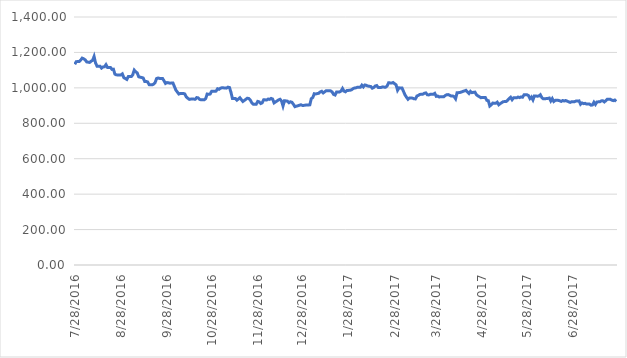
| Category | Series 0 |
|---|---|
| 7/28/16 | 1133 |
| 7/29/16 | 1148 |
| 7/31/16 | 1148.5 |
| 8/1/16 | 1156.5 |
| 8/2/16 | 1168 |
| 8/3/16 | 1164 |
| 8/4/16 | 1158.5 |
| 8/5/16 | 1146.5 |
| 8/7/16 | 1143.5 |
| 8/8/16 | 1150.5 |
| 8/9/16 | 1155 |
| 8/10/16 | 1177 |
| 8/11/16 | 1140.5 |
| 8/12/16 | 1122 |
| 8/14/16 | 1122.5 |
| 8/15/16 | 1111.5 |
| 8/16/16 | 1118 |
| 8/17/16 | 1119 |
| 8/18/16 | 1131 |
| 8/19/16 | 1115.5 |
| 8/21/16 | 1115.5 |
| 8/22/16 | 1104.5 |
| 8/23/16 | 1105.5 |
| 8/24/16 | 1077.5 |
| 8/25/16 | 1073.5 |
| 8/26/16 | 1072.5 |
| 8/28/16 | 1073 |
| 8/29/16 | 1079 |
| 8/30/16 | 1057.5 |
| 8/31/16 | 1053 |
| 9/1/16 | 1047.5 |
| 9/2/16 | 1063.5 |
| 9/4/16 | 1063.5 |
| 9/5/16 | 1074 |
| 9/6/16 | 1100 |
| 9/7/16 | 1090.5 |
| 9/8/16 | 1084.5 |
| 9/9/16 | 1062.5 |
| 9/12/16 | 1056 |
| 9/13/16 | 1036.5 |
| 9/14/16 | 1036.5 |
| 9/15/16 | 1033.5 |
| 9/16/16 | 1018 |
| 9/18/16 | 1017 |
| 9/19/16 | 1021 |
| 9/20/16 | 1029.5 |
| 9/21/16 | 1052.5 |
| 9/22/16 | 1055.5 |
| 9/23/16 | 1053.5 |
| 9/25/16 | 1053.5 |
| 9/26/16 | 1040 |
| 9/27/16 | 1025 |
| 9/28/16 | 1030 |
| 9/29/16 | 1028.5 |
| 9/30/16 | 1026.5 |
| 10/2/16 | 1027.5 |
| 10/3/16 | 1007.5 |
| 10/4/16 | 987 |
| 10/5/16 | 976 |
| 10/6/16 | 965 |
| 10/7/16 | 968.5 |
| 10/9/16 | 968.5 |
| 10/10/16 | 965.5 |
| 10/11/16 | 948.5 |
| 10/12/16 | 941.5 |
| 10/13/16 | 935 |
| 10/14/16 | 936.5 |
| 10/16/16 | 936.5 |
| 10/17/16 | 936 |
| 10/18/16 | 945 |
| 10/19/16 | 943.5 |
| 10/20/16 | 934.5 |
| 10/21/16 | 932.5 |
| 10/23/16 | 932.5 |
| 10/24/16 | 939 |
| 10/25/16 | 965 |
| 10/26/16 | 963.5 |
| 10/27/16 | 965 |
| 10/28/16 | 980.5 |
| 10/30/16 | 981 |
| 10/31/16 | 981.5 |
| 11/1/16 | 995 |
| 11/2/16 | 992 |
| 11/3/16 | 998 |
| 11/4/16 | 1001 |
| 11/6/16 | 999 |
| 11/7/16 | 998.5 |
| 11/8/16 | 1004 |
| 11/9/16 | 1002 |
| 11/10/16 | 975 |
| 11/11/16 | 940 |
| 11/13/16 | 940 |
| 11/14/16 | 930.5 |
| 11/15/16 | 937 |
| 11/16/16 | 944.25 |
| 11/17/16 | 933.5 |
| 11/18/16 | 923 |
| 11/21/16 | 941.5 |
| 11/22/16 | 940 |
| 11/23/16 | 931 |
| 11/24/16 | 916 |
| 11/25/16 | 908 |
| 11/27/16 | 908 |
| 11/28/16 | 923.5 |
| 11/29/16 | 921 |
| 11/30/16 | 911.5 |
| 12/1/16 | 915.5 |
| 12/2/16 | 933 |
| 12/4/16 | 931.5 |
| 12/5/16 | 937 |
| 12/6/16 | 935 |
| 12/7/16 | 940.5 |
| 12/8/16 | 937 |
| 12/9/16 | 915 |
| 12/12/16 | 932 |
| 12/13/16 | 935.5 |
| 12/14/16 | 926 |
| 12/15/16 | 897.5 |
| 12/16/16 | 927.5 |
| 12/18/16 | 925 |
| 12/19/16 | 916 |
| 12/20/16 | 921.5 |
| 12/21/16 | 918.5 |
| 12/22/16 | 907 |
| 12/23/16 | 893.75 |
| 12/27/16 | 904.5 |
| 12/28/16 | 901 |
| 12/29/16 | 901 |
| 12/30/16 | 902.5 |
| 1/2/17 | 904 |
| 1/3/17 | 939 |
| 1/4/17 | 945.25 |
| 1/5/17 | 967 |
| 1/6/17 | 965.5 |
| 1/8/17 | 969.5 |
| 1/9/17 | 977 |
| 1/10/17 | 980.5 |
| 1/11/17 | 971.25 |
| 1/12/17 | 977.5 |
| 1/13/17 | 984 |
| 1/16/17 | 983 |
| 1/17/17 | 977 |
| 1/18/17 | 963 |
| 1/19/17 | 959.5 |
| 1/20/17 | 977 |
| 1/22/17 | 977 |
| 1/23/17 | 982 |
| 1/24/17 | 996.5 |
| 1/25/17 | 981.5 |
| 1/26/17 | 977.75 |
| 1/27/17 | 985.5 |
| 1/29/17 | 986 |
| 1/30/17 | 989 |
| 1/31/17 | 995 |
| 2/1/17 | 999 |
| 2/2/17 | 1000 |
| 2/3/17 | 1003.5 |
| 2/5/17 | 1003.5 |
| 2/6/17 | 1015.25 |
| 2/7/17 | 1005.5 |
| 2/8/17 | 1016.25 |
| 2/9/17 | 1014.25 |
| 2/10/17 | 1010.25 |
| 2/12/17 | 1007.5 |
| 2/13/17 | 998 |
| 2/14/17 | 1002.5 |
| 2/15/17 | 1010.5 |
| 2/16/17 | 1013 |
| 2/17/17 | 1002 |
| 2/19/17 | 1002.5 |
| 2/20/17 | 1005.5 |
| 2/21/17 | 1004 |
| 2/22/17 | 1004 |
| 2/23/17 | 1011 |
| 2/24/17 | 1029 |
| 2/26/17 | 1027 |
| 2/27/17 | 1030 |
| 2/28/17 | 1023.5 |
| 3/1/17 | 1017 |
| 3/2/17 | 986.5 |
| 3/3/17 | 1000 |
| 3/5/17 | 999 |
| 3/6/17 | 979.5 |
| 3/7/17 | 960.5 |
| 3/8/17 | 947 |
| 3/9/17 | 935.5 |
| 3/10/17 | 943 |
| 3/12/17 | 942 |
| 3/13/17 | 938.5 |
| 3/14/17 | 937.5 |
| 3/15/17 | 954 |
| 3/16/17 | 957.5 |
| 3/17/17 | 963 |
| 3/19/17 | 964.5 |
| 3/20/17 | 969.5 |
| 3/21/17 | 971.5 |
| 3/22/17 | 961 |
| 3/23/17 | 960 |
| 3/24/17 | 963.5 |
| 3/26/17 | 963.5 |
| 3/27/17 | 969 |
| 3/28/17 | 952 |
| 3/29/17 | 954 |
| 3/30/17 | 948.5 |
| 3/31/17 | 950 |
| 4/2/17 | 949.5 |
| 4/3/17 | 956.5 |
| 4/4/17 | 961 |
| 4/5/17 | 962 |
| 4/6/17 | 958.5 |
| 4/7/17 | 954 |
| 4/8/17 | 954 |
| 4/9/17 | 951 |
| 4/10/17 | 938.5 |
| 4/11/17 | 972.5 |
| 4/12/17 | 973 |
| 4/13/17 | 974 |
| 4/17/17 | 986 |
| 4/18/17 | 976 |
| 4/19/17 | 968 |
| 4/20/17 | 980 |
| 4/21/17 | 973 |
| 4/23/17 | 976 |
| 4/24/17 | 961.5 |
| 4/25/17 | 954.5 |
| 4/26/17 | 950 |
| 4/27/17 | 944.5 |
| 4/28/17 | 945.5 |
| 4/30/17 | 945.5 |
| 5/1/17 | 929.5 |
| 5/2/17 | 927.5 |
| 5/3/17 | 897.5 |
| 5/4/17 | 904.5 |
| 5/5/17 | 914 |
| 5/7/17 | 913 |
| 5/8/17 | 919 |
| 5/9/17 | 904.5 |
| 5/10/17 | 911 |
| 5/11/17 | 916.5 |
| 5/12/17 | 922 |
| 5/14/17 | 923 |
| 5/15/17 | 930 |
| 5/16/17 | 940 |
| 5/17/17 | 947 |
| 5/18/17 | 933 |
| 5/19/17 | 943.5 |
| 5/21/17 | 943.5 |
| 5/22/17 | 948 |
| 5/23/17 | 945 |
| 5/24/17 | 949 |
| 5/25/17 | 947 |
| 5/26/17 | 960.5 |
| 5/28/17 | 961 |
| 5/29/17 | 956.5 |
| 5/30/17 | 939.5 |
| 5/31/17 | 948.5 |
| 6/1/17 | 932 |
| 6/2/17 | 954.5 |
| 6/4/17 | 953 |
| 6/5/17 | 954 |
| 6/6/17 | 961 |
| 6/7/17 | 944.5 |
| 6/8/17 | 938 |
| 6/9/17 | 938.5 |
| 6/11/17 | 940.5 |
| 6/12/17 | 942.5 |
| 6/13/17 | 926 |
| 6/14/17 | 939.5 |
| 6/15/17 | 923 |
| 6/16/17 | 929.5 |
| 6/18/17 | 929.5 |
| 6/19/17 | 927 |
| 6/20/17 | 923.5 |
| 6/21/17 | 928.5 |
| 6/22/17 | 925.75 |
| 6/23/17 | 928.5 |
| 6/26/17 | 918 |
| 6/27/17 | 921.5 |
| 6/28/17 | 922 |
| 6/29/17 | 922 |
| 6/30/17 | 926 |
| 7/1/17 | 926 |
| 7/2/17 | 926.5 |
| 7/3/17 | 907.5 |
| 7/4/17 | 915 |
| 7/5/17 | 911 |
| 7/6/17 | 912.5 |
| 7/7/17 | 908.5 |
| 7/9/17 | 908.5 |
| 7/10/17 | 902.25 |
| 7/11/17 | 903.5 |
| 7/12/17 | 919 |
| 7/13/17 | 906.5 |
| 7/14/17 | 920.5 |
| 7/16/17 | 921.5 |
| 7/17/17 | 926.5 |
| 7/18/17 | 927 |
| 7/19/17 | 920.5 |
| 7/20/17 | 927.5 |
| 7/21/17 | 936 |
| 7/23/17 | 935.5 |
| 7/24/17 | 930.5 |
| 7/25/17 | 928 |
| 7/26/17 | 931.5 |
| 7/27/17 | 923.5 |